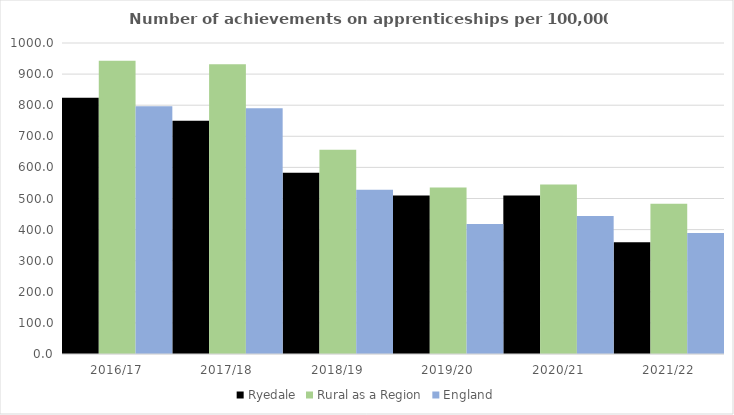
| Category | Ryedale | Rural as a Region | England |
|---|---|---|---|
| 2016/17 | 824 | 942.594 | 797 |
| 2017/18 | 750 | 931.709 | 790 |
| 2018/19 | 583 | 656.44 | 528 |
| 2019/20 | 510 | 535.552 | 418 |
| 2020/21 | 510 | 545.333 | 444 |
| 2021/22 | 359 | 482.936 | 389 |